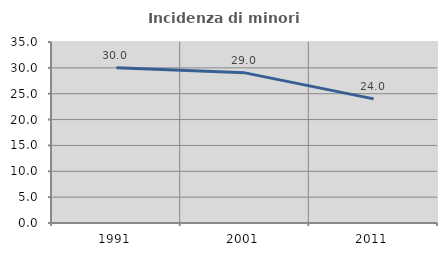
| Category | Incidenza di minori stranieri |
|---|---|
| 1991.0 | 30 |
| 2001.0 | 29.032 |
| 2011.0 | 24 |